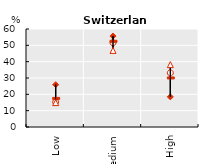
| Category | Series 0 | Series 1 | Series 2 | Series 3 |
|---|---|---|---|---|
| Low | 25.897 | 15.27 | 17.511 | 14.932 |
| Medium | 55.669 | 51.594 | 52.453 | 46.875 |
| High | 18.434 | 33.136 | 30.036 | 38.193 |